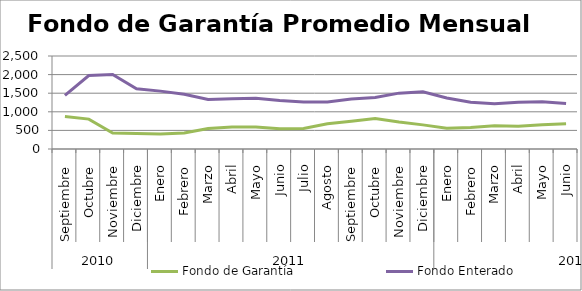
| Category | Fondo de Garantía | Fondo Enterado |
|---|---|---|
| 0 | 871.43 | 1439.553 |
| 1 | 804.208 | 1973.732 |
| 2 | 428.758 | 2004.096 |
| 3 | 417.974 | 1620.905 |
| 4 | 403.651 | 1555.632 |
| 5 | 429.02 | 1474.054 |
| 6 | 551.344 | 1328.521 |
| 7 | 591.732 | 1351.463 |
| 8 | 591.784 | 1363.301 |
| 9 | 544.875 | 1304.985 |
| 10 | 551.606 | 1265.502 |
| 11 | 679.839 | 1266.018 |
| 12 | 747.74 | 1344.929 |
| 13 | 819.75 | 1383.171 |
| 14 | 723.635 | 1501.378 |
| 15 | 648.288 | 1537.485 |
| 16 | 560.173 | 1370.992 |
| 17 | 575.916 | 1258.831 |
| 18 | 622.075 | 1216.471 |
| 19 | 612.299 | 1258.963 |
| 20 | 654.277 | 1273.362 |
| 21 | 675.965 | 1225.977 |